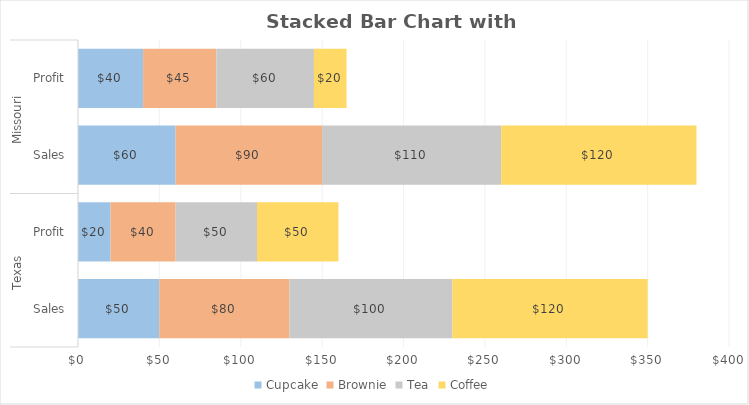
| Category | Cupcake | Brownie | Tea | Coffee |
|---|---|---|---|---|
| 0 | 50 | 80 | 100 | 120 |
| 1 | 20 | 40 | 50 | 50 |
| 2 | 60 | 90 | 110 | 120 |
| 3 | 40 | 45 | 60 | 20 |